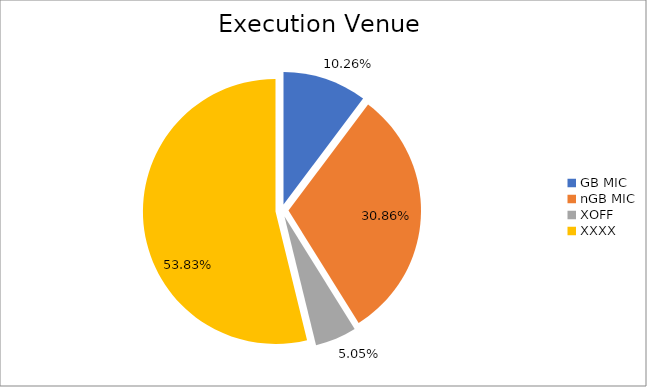
| Category | Series 0 |
|---|---|
| GB MIC | 990824.116 |
| nGB MIC | 2981896.12 |
| XOFF | 488080.325 |
| XXXX | 5200646.214 |